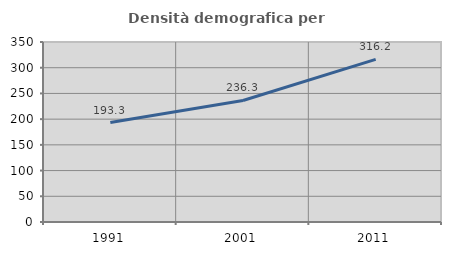
| Category | Densità demografica |
|---|---|
| 1991.0 | 193.282 |
| 2001.0 | 236.261 |
| 2011.0 | 316.165 |